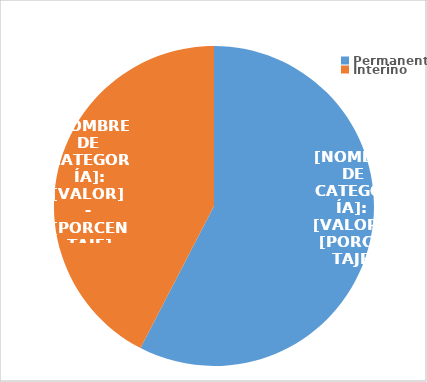
| Category | Series 0 |
|---|---|
| Permanente | 3222 |
| Interino | 2372 |